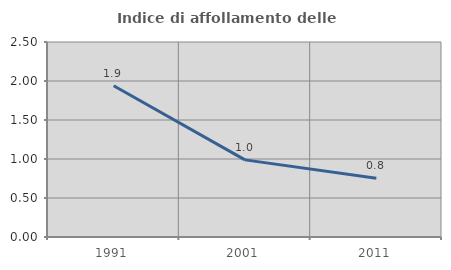
| Category | Indice di affollamento delle abitazioni  |
|---|---|
| 1991.0 | 1.939 |
| 2001.0 | 0.989 |
| 2011.0 | 0.753 |